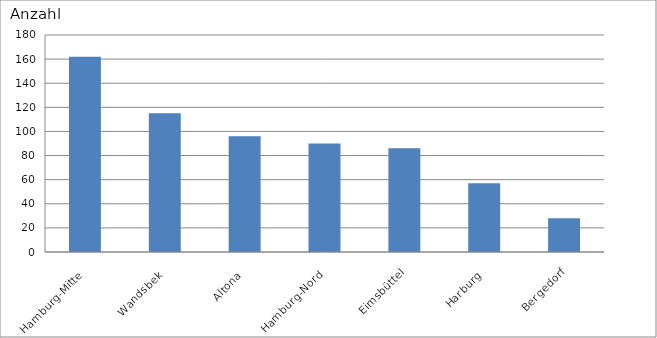
| Category | Hamburg-Mitte Wandsbek Altona Hamburg-Nord Eimsbüttel Harburg Bergedorf |
|---|---|
| Hamburg-Mitte | 162 |
| Wandsbek | 115 |
| Altona | 96 |
| Hamburg-Nord | 90 |
| Eimsbüttel | 86 |
| Harburg | 57 |
| Bergedorf | 28 |